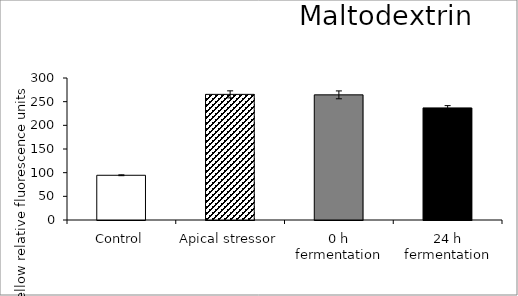
| Category | average |
|---|---|
| Control | 94.502 |
| Apical stressor | 265.426 |
| 0 h fermentation | 264.394 |
| 24 h fermentation | 236.804 |